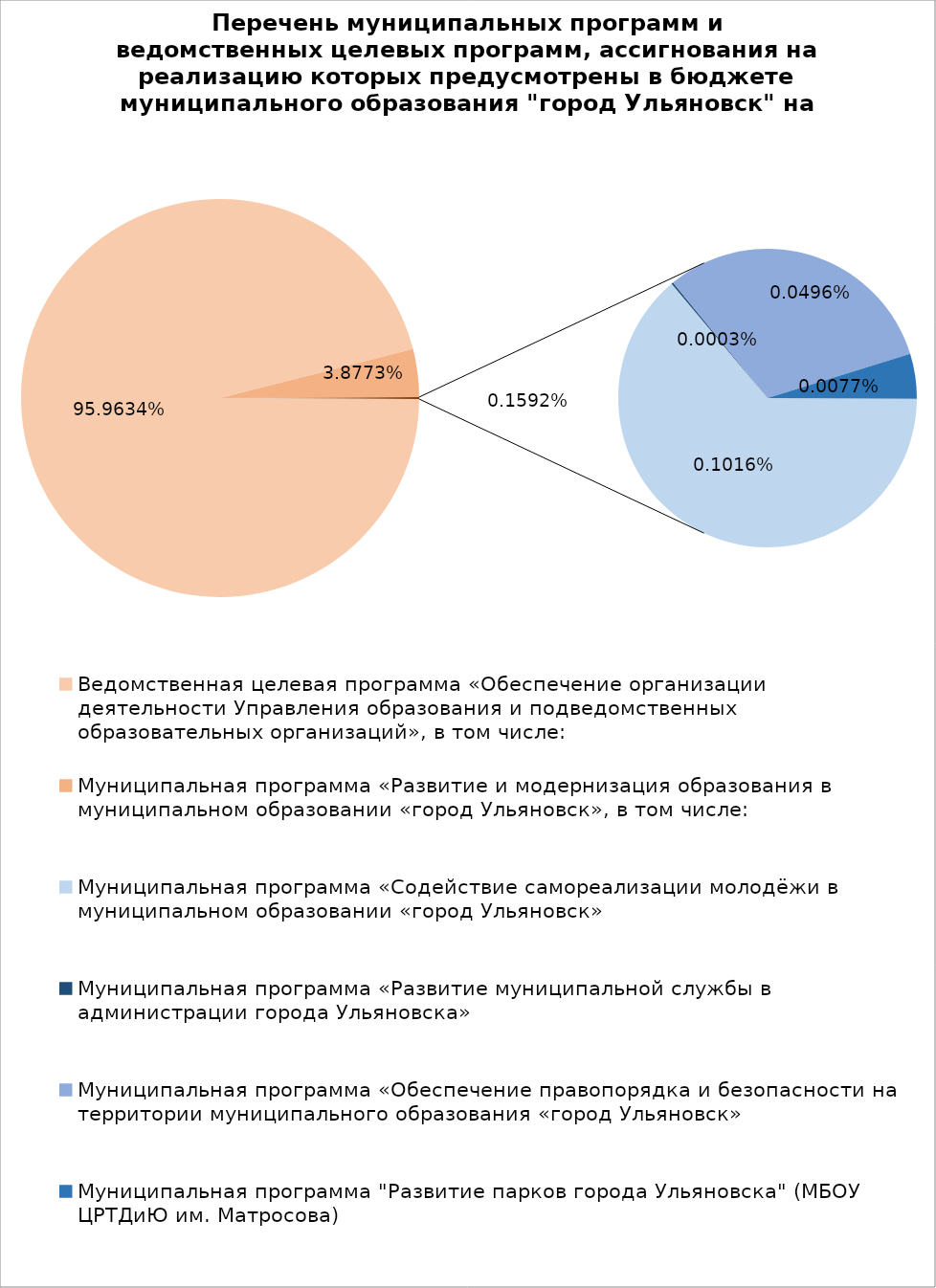
| Category | Series 0 |
|---|---|
| Ведомственная целевая программа «Обеспечение организации деятельности Управления образования и подведомственных образовательных организаций», в том числе: | 4963601.01 |
| Муниципальная программа «Развитие и модернизация образования в муниципальном образовании «город Ульяновск», в том числе: | 200551.5 |
| Муниципальная программа «Содействие самореализации молодёжи в муниципальном образовании «город Ульяновск» | 5254.4 |
| Муниципальная программа «Развитие муниципальной службы в администрации города Ульяновска» | 15.4 |
| Муниципальная программа «Обеспечение правопорядка и безопасности на территории муниципального образования «город Ульяновск» | 2565 |
| Муниципальная программа "Развитие парков города Ульяновска" (МБОУ ЦРТДиЮ им. Матросова) | 400 |